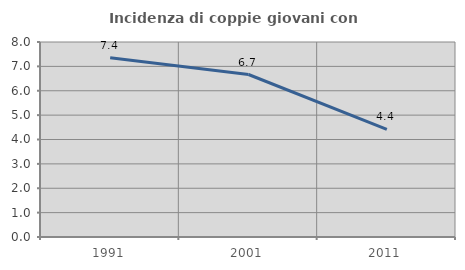
| Category | Incidenza di coppie giovani con figli |
|---|---|
| 1991.0 | 7.353 |
| 2001.0 | 6.667 |
| 2011.0 | 4.412 |